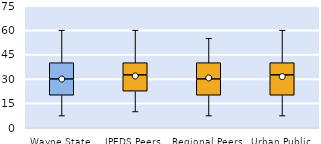
| Category | 25th | 50th | 75th |
|---|---|---|---|
| Wayne State | 20 | 10 | 10 |
| IPEDS Peers | 22.5 | 10 | 7.5 |
| Regional Peers | 20 | 10 | 10 |
| Urban Public | 20 | 12.5 | 7.5 |